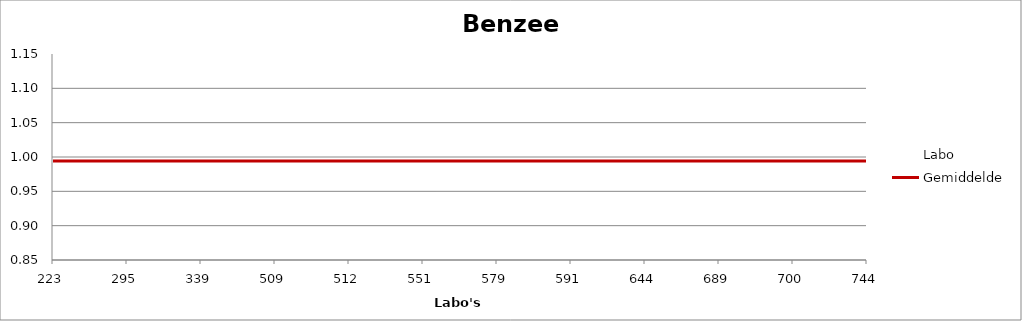
| Category | Labo | Gemiddelde |
|---|---|---|
| 223.0 | 1.014 | 0.994 |
| 295.0 | 0.98 | 0.994 |
| 339.0 | 0.94 | 0.994 |
| 509.0 | 0.951 | 0.994 |
| 512.0 | 1.029 | 0.994 |
| 551.0 | 1.005 | 0.994 |
| 579.0 | 0.92 | 0.994 |
| 591.0 | 1.048 | 0.994 |
| 644.0 | 0.997 | 0.994 |
| 689.0 | 1.014 | 0.994 |
| 700.0 | 1.042 | 0.994 |
| 744.0 | 0.984 | 0.994 |